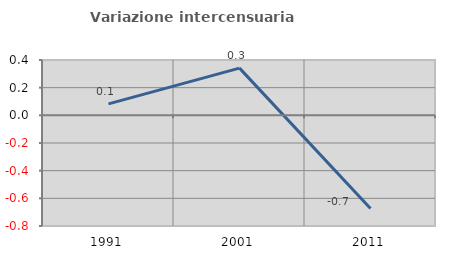
| Category | Variazione intercensuaria annua |
|---|---|
| 1991.0 | 0.083 |
| 2001.0 | 0.341 |
| 2011.0 | -0.674 |